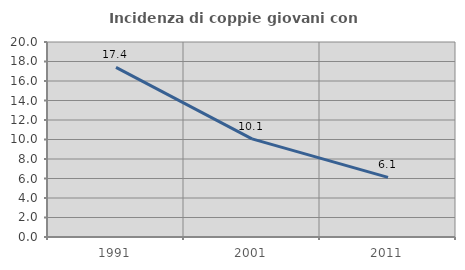
| Category | Incidenza di coppie giovani con figli |
|---|---|
| 1991.0 | 17.403 |
| 2001.0 | 10.066 |
| 2011.0 | 6.114 |